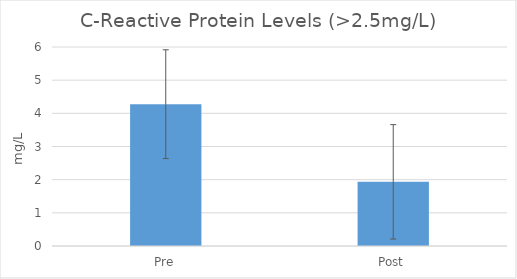
| Category | Series 0 |
|---|---|
| Pre | 4.276 |
| Post | 1.935 |